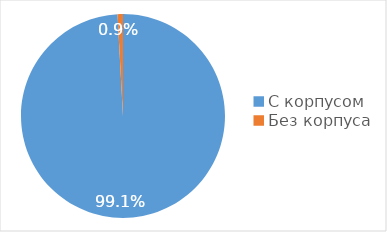
| Category | Доля, % |
|---|---|
| С корпусом | 0.991 |
| Без корпуса | 0.009 |